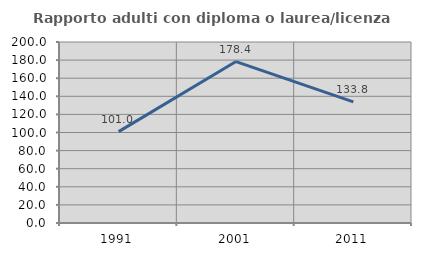
| Category | Rapporto adulti con diploma o laurea/licenza media  |
|---|---|
| 1991.0 | 101 |
| 2001.0 | 178.378 |
| 2011.0 | 133.775 |